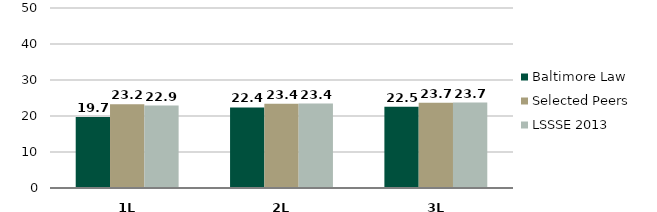
| Category | Baltimore Law | Selected Peers | LSSSE 2013 |
|---|---|---|---|
| 0 | 19.725 | 23.234 | 22.906 |
| 1 | 22.366 | 23.397 | 23.447 |
| 2 | 22.536 | 23.714 | 23.729 |